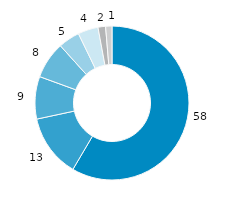
| Category | 58,47428427 13,16843065 8,922674424 7,760915503 4,503416669 4,250025156 1,589566734 1,330381673 |
|---|---|
| 0 | 58.474 |
| 1 | 13.168 |
| 2 | 8.923 |
| 3 | 7.761 |
| 4 | 4.503 |
| 5 | 4.25 |
| 6 | 1.59 |
| 7 | 1.33 |